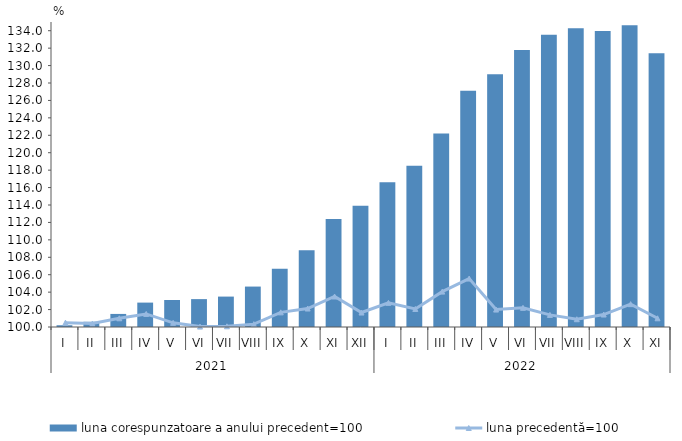
| Category | luna corespunzatoare a anului precedent=100 |
|---|---|
| 0 | 100.2 |
| 1 | 100.6 |
| 2 | 101.5 |
| 3 | 102.8 |
| 4 | 103.1 |
| 5 | 103.2 |
| 6 | 103.49 |
| 7 | 104.64 |
| 8 | 106.68 |
| 9 | 108.8 |
| 10 | 112.4 |
| 11 | 113.9 |
| 12 | 116.6 |
| 13 | 118.5 |
| 14 | 122.2 |
| 15 | 127.1 |
| 16 | 129 |
| 17 | 131.8 |
| 18 | 133.55 |
| 19 | 134.29 |
| 20 | 133.97 |
| 21 | 134.62 |
| 22 | 131.4 |